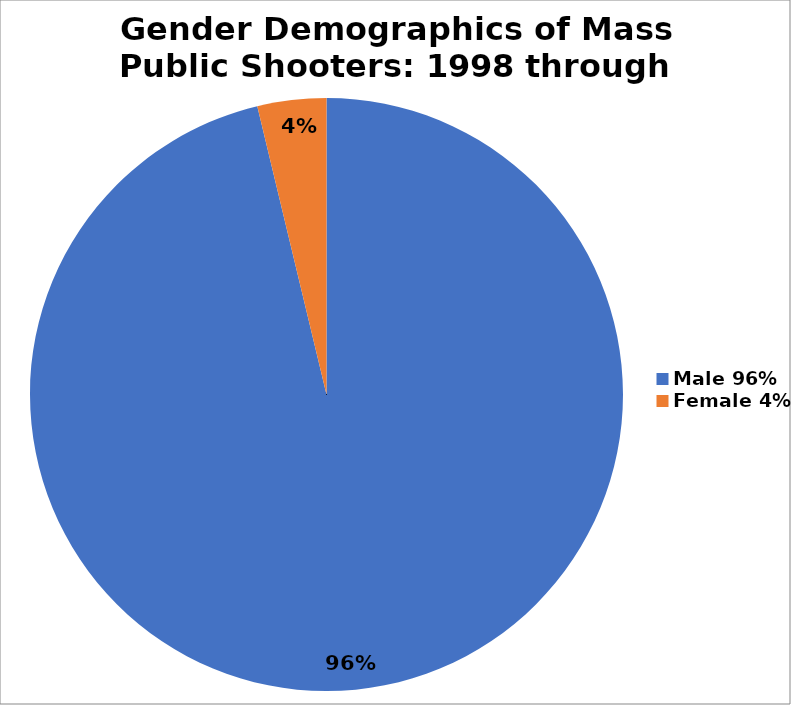
| Category | Series 0 |
|---|---|
| Male 96% | 0.962 |
| Female 4% | 0.038 |